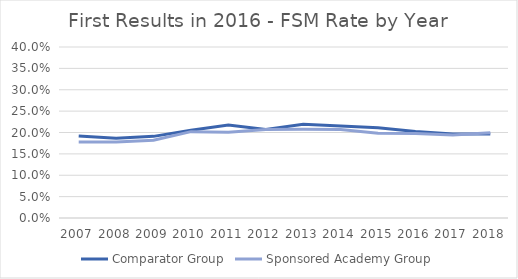
| Category | Comparator Group | Sponsored Academy Group |
|---|---|---|
| 2007.0 | 0.192 | 0.178 |
| 2008.0 | 0.186 | 0.178 |
| 2009.0 | 0.191 | 0.182 |
| 2010.0 | 0.205 | 0.202 |
| 2011.0 | 0.218 | 0.201 |
| 2012.0 | 0.207 | 0.207 |
| 2013.0 | 0.219 | 0.208 |
| 2014.0 | 0.215 | 0.207 |
| 2015.0 | 0.211 | 0.198 |
| 2016.0 | 0.202 | 0.197 |
| 2017.0 | 0.196 | 0.194 |
| 2018.0 | 0.196 | 0.199 |